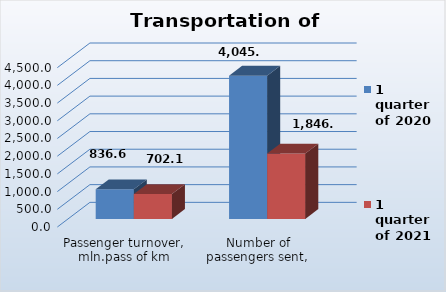
| Category | 1 quarter of 2020 | 1 quarter of 2021 |
|---|---|---|
| Passenger turnover, mln.pass of km | 836.6 | 702.1 |
| Number of passengers sent, thous pass. | 4045.9 | 1846.7 |